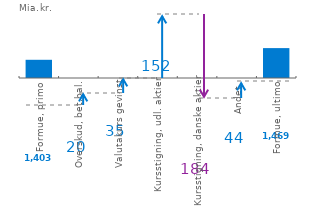
| Category | Series 0 |
|---|---|
| Formue, primo | 1402.774 |
| Overskud, bet.bal. | 1402.774 |
| Valutakurs gevinst | 1422.406 |
| Kursstigning, udl. aktier | 1457.213 |
| Kursstigning, danske aktier | 1424.702 |
| Andet | 1424.702 |
| Formue, ultimo | 1468.76 |